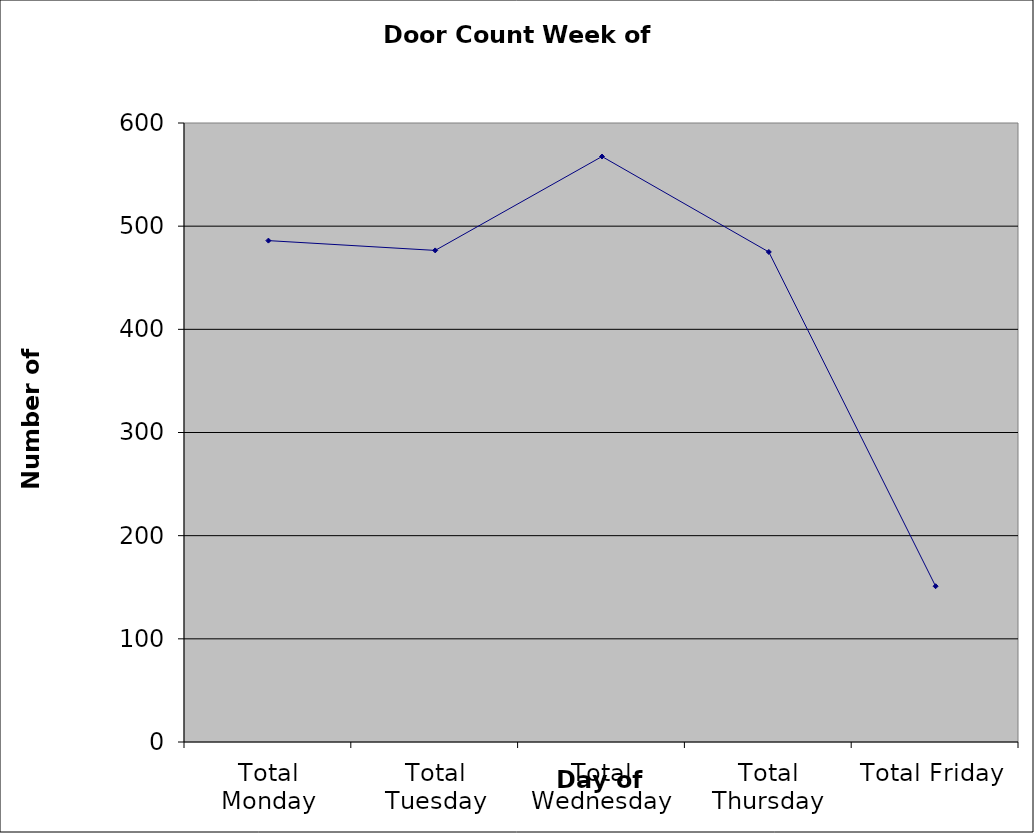
| Category | Series 0 |
|---|---|
| Total Monday | 486 |
| Total Tuesday | 476.5 |
| Total Wednesday | 567.5 |
| Total Thursday | 475 |
| Total Friday | 151 |